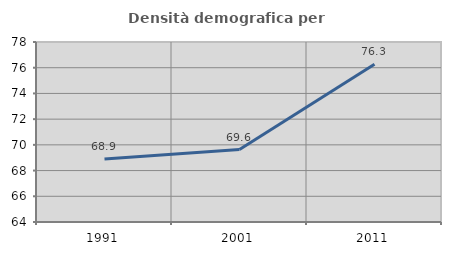
| Category | Densità demografica |
|---|---|
| 1991.0 | 68.898 |
| 2001.0 | 69.635 |
| 2011.0 | 76.267 |